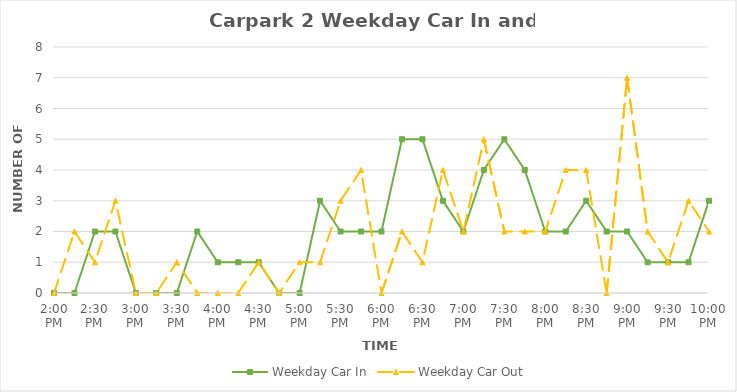
| Category | Weekday Car In | Weekday Car Out |
|---|---|---|
| 0.5833333333333334 | 0 | 0 |
| 0.59375 | 0 | 2 |
| 0.604166666666667 | 2 | 1 |
| 0.614583333333334 | 2 | 3 |
| 0.625 | 0 | 0 |
| 0.635416666666667 | 0 | 0 |
| 0.645833333333334 | 0 | 1 |
| 0.656250000000001 | 2 | 0 |
| 0.666666666666667 | 1 | 0 |
| 0.677083333333334 | 1 | 0 |
| 0.687500000000001 | 1 | 1 |
| 0.697916666666668 | 0 | 0 |
| 0.708333333333335 | 0 | 1 |
| 0.718750000000002 | 3 | 1 |
| 0.729166666666669 | 2 | 3 |
| 0.739583333333336 | 2 | 4 |
| 0.75 | 2 | 0 |
| 0.7604166666666666 | 5 | 2 |
| 0.7708333333333334 | 5 | 1 |
| 0.78125 | 3 | 4 |
| 0.7916666666666666 | 2 | 2 |
| 0.8020833333333334 | 4 | 5 |
| 0.8125 | 5 | 2 |
| 0.8229166666666666 | 4 | 2 |
| 0.8333333333333334 | 2 | 2 |
| 0.84375 | 2 | 4 |
| 0.8541666666666666 | 3 | 4 |
| 0.8645833333333334 | 2 | 0 |
| 0.875 | 2 | 7 |
| 0.8854166666666666 | 1 | 2 |
| 0.8958333333333334 | 1 | 1 |
| 0.90625 | 1 | 3 |
| 0.9166666666666666 | 3 | 2 |